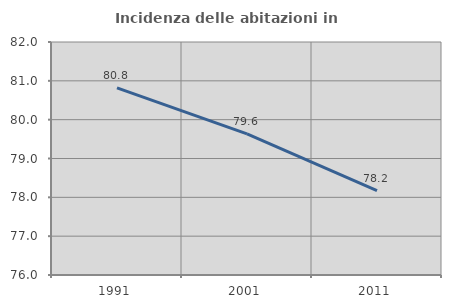
| Category | Incidenza delle abitazioni in proprietà  |
|---|---|
| 1991.0 | 80.816 |
| 2001.0 | 79.632 |
| 2011.0 | 78.17 |